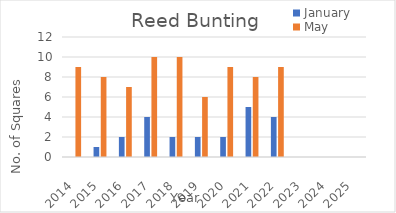
| Category | January | May |
|---|---|---|
| 2014.0 | 0 | 9 |
| 2015.0 | 1 | 8 |
| 2016.0 | 2 | 7 |
| 2017.0 | 4 | 10 |
| 2018.0 | 2 | 10 |
| 2019.0 | 2 | 6 |
| 2020.0 | 2 | 9 |
| 2021.0 | 5 | 8 |
| 2022.0 | 4 | 9 |
| 2023.0 | 0 | 0 |
| 2024.0 | 0 | 0 |
| 2025.0 | 0 | 0 |